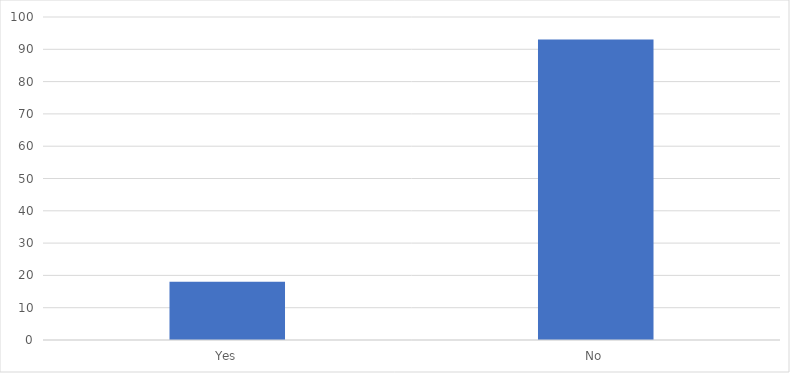
| Category | Number of Responses |
|---|---|
| Yes | 18 |
| No | 93 |